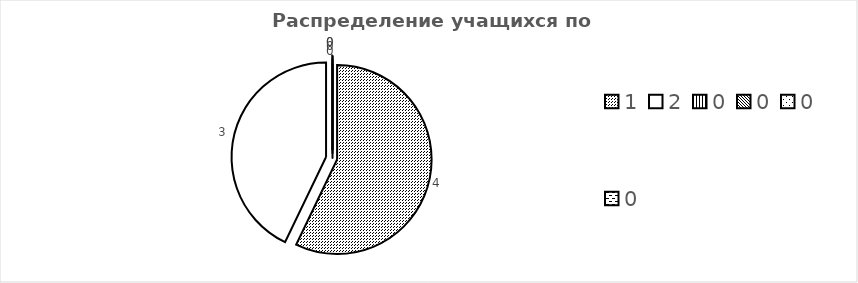
| Category | Series 1 |
|---|---|
| 1.0 | 4 |
| 2.0 | 3 |
| 0.0 | 0 |
| 0.0 | 0 |
| 0.0 | 0 |
| 0.0 | 0 |